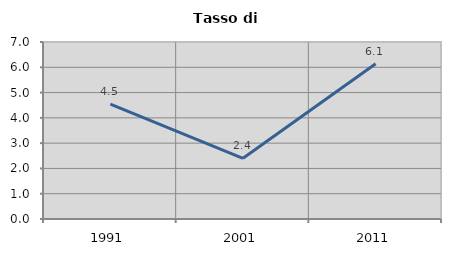
| Category | Tasso di disoccupazione   |
|---|---|
| 1991.0 | 4.541 |
| 2001.0 | 2.4 |
| 2011.0 | 6.137 |